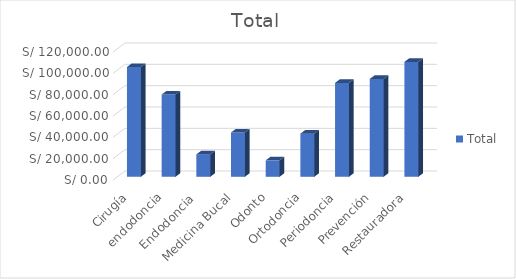
| Category | Total |
|---|---|
| Cirugía | 102900 |
| endodoncia | 77100 |
| Endodoncia  | 21000 |
| Medicina Bucal | 41500 |
| Odonto | 15400 |
| Ortodoncia | 40400 |
| Periodoncia | 88000 |
| Prevención | 91700 |
| Restauradora | 107700 |